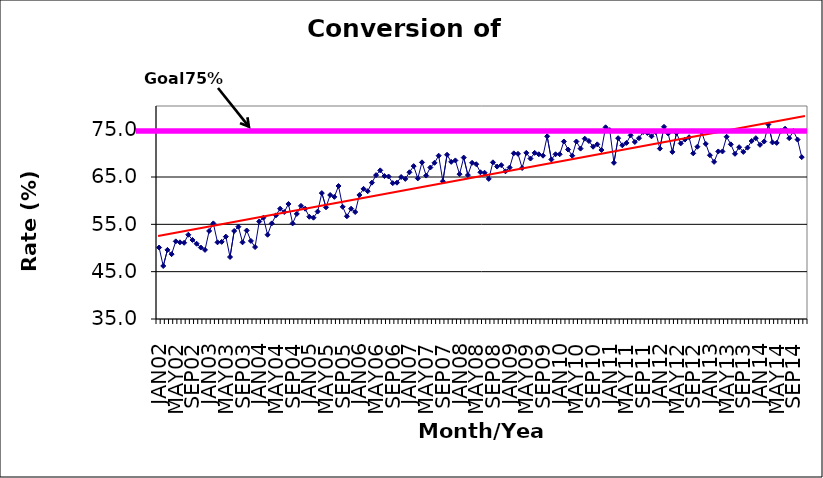
| Category | Series 0 |
|---|---|
| JAN02 | 50.1 |
| FEB02 | 46.2 |
| MAR02 | 49.6 |
| APR02 | 48.7 |
| MAY02 | 51.4 |
| JUN02 | 51.2 |
| JUL02 | 51.1 |
| AUG02 | 52.8 |
| SEP02 | 51.7 |
| OCT02 | 50.9 |
| NOV02 | 50.1 |
| DEC02 | 49.6 |
| JAN03 | 53.6 |
| FEB03 | 55.2 |
| MAR03 | 51.2 |
| APR03 | 51.3 |
| MAY03 | 52.4 |
| JUN03 | 48.1 |
| JUL03 | 53.6 |
| AUG03 | 54.5 |
| SEP03 | 51.2 |
| OCT03 | 53.7 |
| NOV03 | 51.5 |
| DEC03 | 50.2 |
| JAN04 | 55.6 |
| FEB04 | 56.4 |
| MAR04 | 52.8 |
| APR04 | 55.2 |
| MAY04 | 56.9 |
| JUN04 | 58.3 |
| JUL04 | 57.6 |
| AUG04 | 59.3 |
| SEP04 | 55.2 |
| OCT04 | 57.2 |
| NOV04 | 58.9 |
| DEC04 | 58.3 |
| JAN05 | 56.6 |
| FEB05 | 56.4 |
| MAR05 | 57.7 |
| APR05 | 61.6 |
| MAY05 | 58.6 |
| JUN05 | 61.2 |
| JUL05 | 60.8 |
| AUG05 | 63.1 |
| SEP05 | 58.7 |
| OCT05 | 56.7 |
| NOV05 | 58.3 |
| DEC05 | 57.6 |
| JAN06 | 61.2 |
| FEB06 | 62.5 |
| MAR06 | 62 |
| APR06 | 63.8 |
| MAY06 | 65.4 |
| JUN06 | 66.4 |
| JUL06 | 65.2 |
| AUG06 | 65.1 |
| SEP06 | 63.7 |
| OCT06 | 63.8 |
| NOV06 | 65 |
| DEC06 | 64.6 |
| JAN07 | 66 |
| FEB07 | 67.3 |
| MAR07 | 64.7 |
| APR07 | 68.1 |
| MAY07 | 65.3 |
| JUN07 | 67 |
| JUL07 | 68 |
| AUG07 | 69.5 |
| SEP07 | 64.1 |
| OCT07 | 69.7 |
| NOV07 | 68.2 |
| DEC07 | 68.5 |
| JAN08 | 65.6 |
| FEB08 | 69.1 |
| MAR08 | 65.4 |
| APR08 | 68 |
| MAY08 | 67.7 |
| JUN08 | 66 |
| JUL08 | 65.9 |
| AUG08 | 64.6 |
| SEP08 | 68.1 |
| OCT08 | 67.2 |
| NOV08 | 67.5 |
| DEC08 | 66.2 |
| JAN09 | 67 |
| FEB09 | 70 |
| MAR09 | 69.9 |
| APR09 | 66.9 |
| MAY09 | 70.1 |
| JUN09 | 68.9 |
| JUL09 | 70.1 |
| AUG09 | 69.8 |
| SEP09 | 69.5 |
| OCT09 | 73.6 |
| NOV09 | 68.7 |
| DEC09 | 69.8 |
| JAN10 | 69.8 |
| FEB10 | 72.5 |
| MAR10 | 70.8 |
| APR10 | 69.5 |
| MAY10 | 72.5 |
| JUN10 | 71 |
| JUL10 | 73.1 |
| AUG10 | 72.6 |
| SEP10 | 71.4 |
| OCT10 | 71.9 |
| NOV10 | 70.7 |
| DEC10 | 75.5 |
| JAN11 | 74.9 |
| FEB11 | 68 |
| MAR11 | 73.2 |
| APR11 | 71.7 |
| MAY11 | 72.2 |
| JUN11 | 73.8 |
| JUL11 | 72.4 |
| AUG11 | 73.2 |
| SEP11 | 74.5 |
| OCT11 | 74.3 |
| NOV11 | 73.6 |
| DEC11 | 74.5 |
| JAN12 | 71 |
| FEB12 | 75.6 |
| MAR12 | 74.2 |
| APR12 | 70.3 |
| MAY12 | 74.3 |
| JUN12 | 72.1 |
| JUL12 | 72.9 |
| AUG12 | 73.4 |
| SEP12 | 70 |
| OCT12 | 71.4 |
| NOV12 | 74.5 |
| DEC12 | 72 |
| JAN13 | 69.6 |
| FEB13 | 68.2 |
| MAR13 | 70.4 |
| APR13 | 70.4 |
| MAY13 | 73.5 |
| JUN13 | 71.9 |
| JUL13 | 69.9 |
| AUG13 | 71.3 |
| SEP13 | 70.3 |
| OCT13 | 71.2 |
| NOV13 | 72.6 |
| DEC13 | 73.2 |
| JAN14 | 71.8 |
| FEB14 | 72.5 |
| MAR14 | 76.1 |
| APR14 | 72.3 |
| MAY14 | 72.2 |
| JUN14 | 74.7 |
| JUL14 | 75.2 |
| AUG14 | 73.2 |
| SEP14 | 74.7 |
| OCT14 | 72.9 |
| NOV14 | 69.2 |